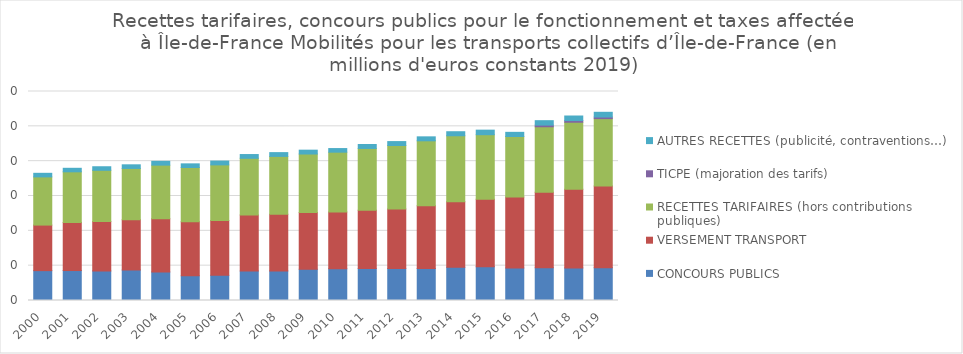
| Category | CONCOURS PUBLICS | VERSEMENT TRANSPORT | RECETTES TARIFAIRES (hors contributions publiques) | TICPE (majoration des tarifs) | AUTRES RECETTES (publicité, contraventions…) |
|---|---|---|---|---|---|
| 2000.0 | 1714166714.1 | 2616231626.079 | 2766288035.193 | 0 | 205938968.304 |
| 2001.0 | 1720052610.575 | 2763700399.077 | 2904186415.5 | 0 | 202923034.237 |
| 2002.0 | 1700355078.878 | 2836722266.089 | 2937471446.953 | 0 | 205319163.587 |
| 2003.0 | 1751637270.349 | 2891782202.84 | 2939769755.928 | 0 | 207575548.618 |
| 2004.0 | 1637508710.333 | 3055169043.172 | 3079981907.246 | 0 | 217944837.98 |
| 2005.0 | 1415587360.17 | 3100774128.074 | 3120695240.87 | 0 | 208724365.48 |
| 2006.0 | 1444362621.732 | 3154464050.035 | 3187726910.155 | 0 | 218637151.769 |
| 2007.0 | 1694047950.423 | 3220278965.063 | 3250149542.668 | 0 | 215971000.053 |
| 2008.0 | 1698906510.478 | 3248932748.068 | 3326277351.35 | 0 | 216750554.13 |
| 2009.0 | 1794734926.465 | 3254266261.255 | 3361503080.098 | 0 | 221089618.795 |
| 2010.0 | 1824257049.147 | 3260461127.127 | 3431748994.568 | 0 | 207344712.118 |
| 2011.0 | 1834147439.965 | 3340573095.198 | 3555817903.318 | 0 | 225264494.438 |
| 2012.0 | 1830642373.706 | 3424645747.678 | 3643761292.49 | 0 | 225601926.013 |
| 2013.0 | 1837117467.461 | 3596230916.679 | 3735019902.783 | 0 | 228226245.294 |
| 2014.0 | 1903239179.519 | 3770589009.746 | 3784037280.968 | 0 | 232850692.131 |
| 2015.0 | 1941491827.426 | 3875601184.501 | 3702613454.013 | 0 | 260821357.729 |
| 2016.0 | 1864782690.134 | 4077562543.717 | 3473351576.39 | 0 | 239447756.875 |
| 2017.0 | 1879746714.203 | 4330870666.859 | 3763911593.901 | 96059307.49 | 254691573.92 |
| 2018.0 | 1872760466.926 | 4511697898.231 | 3851791820.106 | 94055286.115 | 262815786.884 |
| 2019.0 | 1884513123.05 | 4685521000 | 3872179469.301 | 91521000 | 272431800.584 |